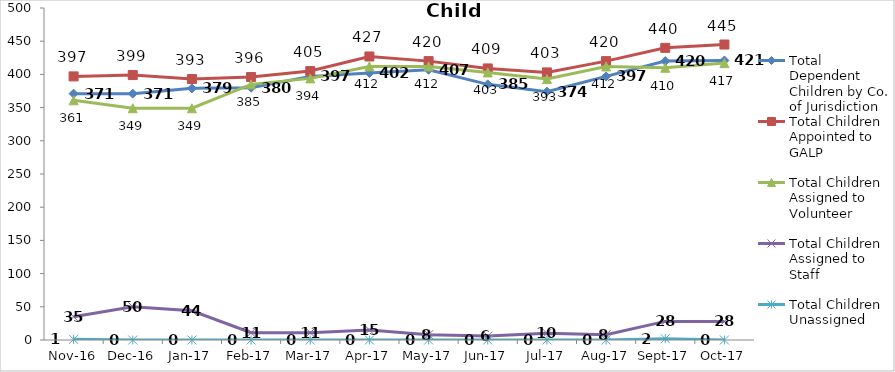
| Category | Total Dependent Children by Co. of Jurisdiction | Total Children Appointed to GALP | Total Children Assigned to Volunteer | Total Children Assigned to Staff | Total Children Unassigned |
|---|---|---|---|---|---|
| 2016-11-01 | 371 | 397 | 361 | 35 | 1 |
| 2016-12-01 | 371 | 399 | 349 | 50 | 0 |
| 2017-01-01 | 379 | 393 | 349 | 44 | 0 |
| 2017-02-01 | 380 | 396 | 385 | 11 | 0 |
| 2017-03-01 | 397 | 405 | 394 | 11 | 0 |
| 2017-04-01 | 402 | 427 | 412 | 15 | 0 |
| 2017-05-01 | 407 | 420 | 412 | 8 | 0 |
| 2017-06-01 | 385 | 409 | 403 | 6 | 0 |
| 2017-07-01 | 374 | 403 | 393 | 10 | 0 |
| 2017-08-01 | 397 | 420 | 412 | 8 | 0 |
| 2017-09-01 | 420 | 440 | 410 | 28 | 2 |
| 2017-10-01 | 421 | 445 | 417 | 28 | 0 |